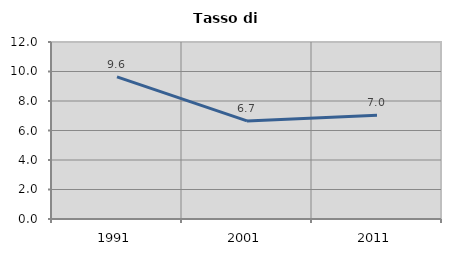
| Category | Tasso di disoccupazione   |
|---|---|
| 1991.0 | 9.64 |
| 2001.0 | 6.65 |
| 2011.0 | 7.026 |